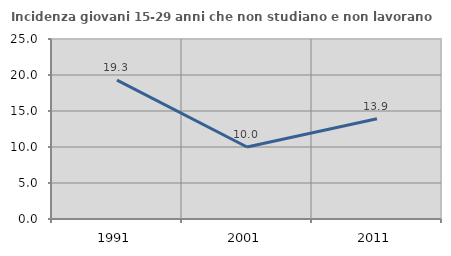
| Category | Incidenza giovani 15-29 anni che non studiano e non lavorano  |
|---|---|
| 1991.0 | 19.285 |
| 2001.0 | 10 |
| 2011.0 | 13.936 |